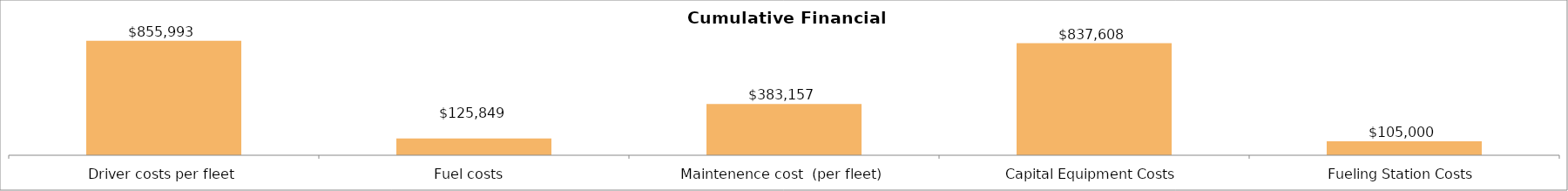
| Category | Series 0 |
|---|---|
| Driver costs per fleet | 855992.789 |
| Fuel costs  | 125849.306 |
| Maintenence cost  (per fleet) | 383157.198 |
| Capital Equipment Costs | 837608 |
| Fueling Station Costs | 105000 |